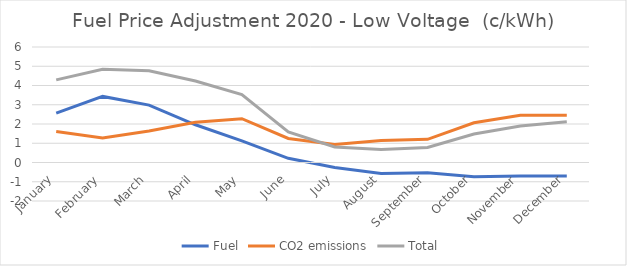
| Category | Fuel | CO2 emissions | Total |
|---|---|---|---|
| January | 2.567 | 1.613 | 4.292 |
| February | 3.433 | 1.269 | 4.844 |
| March | 2.981 | 1.635 | 4.766 |
| April | 1.96 | 2.089 | 4.23 |
| May | 1.124 | 2.275 | 3.523 |
| June | 0.217 | 1.248 | 1.583 |
| July | -0.258 | 0.93 | 0.804 |
| August | -0.566 | 1.138 | 0.676 |
| September | -0.527 | 1.202 | 0.785 |
| October | -0.74 | 2.061 | 1.477 |
| November | -0.699 | 2.458 | 1.898 |
| December | -0.699 | 2.458 | 2.118 |